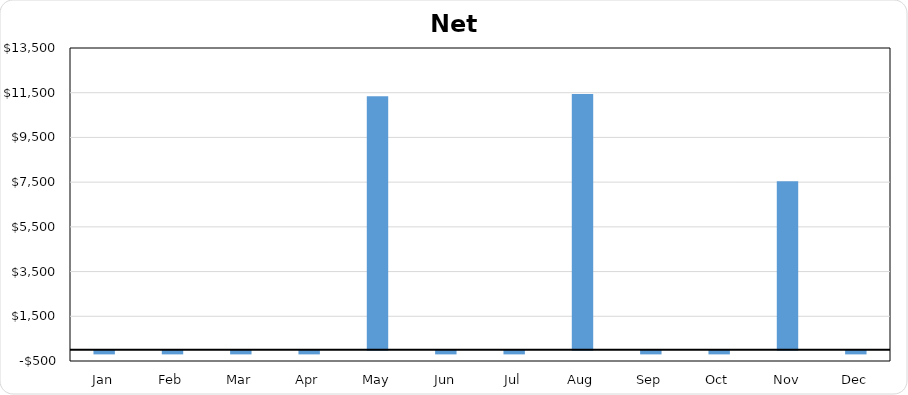
| Category | Series 0 |
|---|---|
| Jan | -159.333 |
| Feb | -159.333 |
| Mar | -159.333 |
| Apr | -159.333 |
| May | 11340.667 |
| Jun | -159.333 |
| Jul | -159.333 |
| Aug | 11440.667 |
| Sep | -159.333 |
| Oct | -159.333 |
| Nov | 7540.667 |
| Dec | -159.333 |